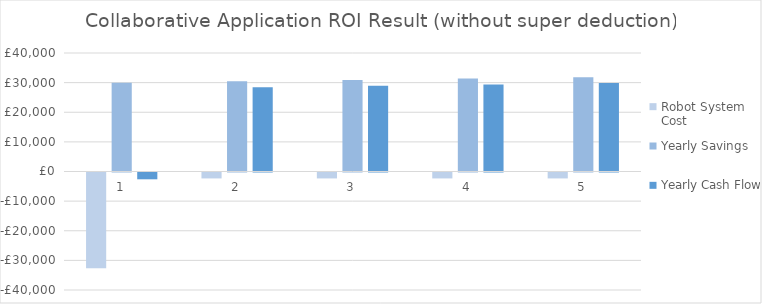
| Category | Robot System Cost | Yearly Savings | Yearly Cash Flow |
|---|---|---|---|
| 0 | -32295 | 30000 | -2295 |
| 1 | -2000 | 30450 | 28450 |
| 2 | -2000 | 30906.75 | 28906.75 |
| 3 | -2000 | 31370.351 | 29370.351 |
| 4 | -2000 | 31840.907 | 29840.907 |